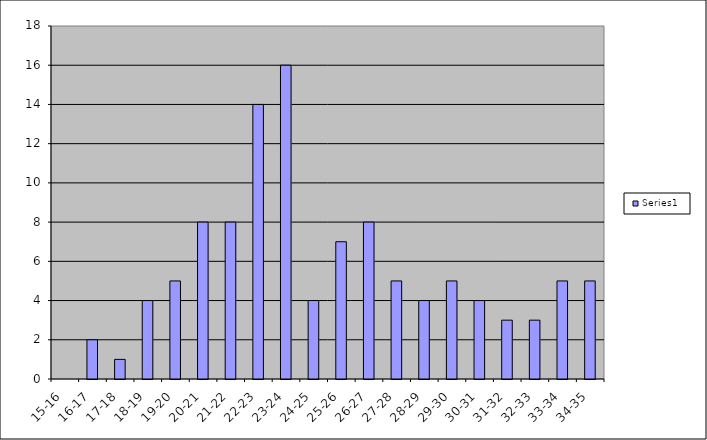
| Category | Series 0 |
|---|---|
| 15-16 | 0 |
| 16-17 | 2 |
| 17-18 | 1 |
| 18-19 | 4 |
| 19-20 | 5 |
| 20-21 | 8 |
| 21-22 | 8 |
| 22-23 | 14 |
| 23-24 | 16 |
| 24-25 | 4 |
| 25-26 | 7 |
| 26-27 | 8 |
| 27-28 | 5 |
| 28-29 | 4 |
| 29-30 | 5 |
| 30-31 | 4 |
| 31-32 | 3 |
| 32-33 | 3 |
| 33-34 | 5 |
| 34-35 | 5 |